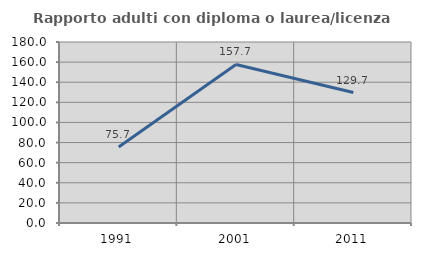
| Category | Rapporto adulti con diploma o laurea/licenza media  |
|---|---|
| 1991.0 | 75.676 |
| 2001.0 | 157.692 |
| 2011.0 | 129.703 |